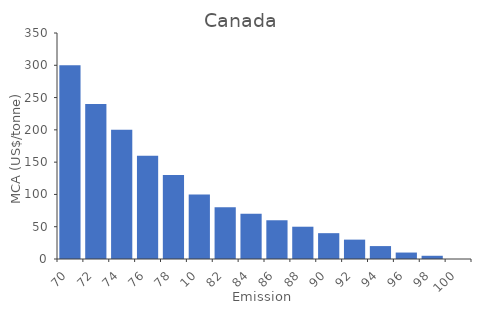
| Category | TCA (million $) |
|---|---|
| 70.0 | 300 |
| 72.0 | 240 |
| 74.0 | 200 |
| 76.0 | 160 |
| 78.0 | 130 |
| 10.0 | 100 |
| 82.0 | 80 |
| 84.0 | 70 |
| 86.0 | 60 |
| 88.0 | 50 |
| 90.0 | 40 |
| 92.0 | 30 |
| 94.0 | 20 |
| 96.0 | 10 |
| 98.0 | 5 |
| 100.0 | 0 |